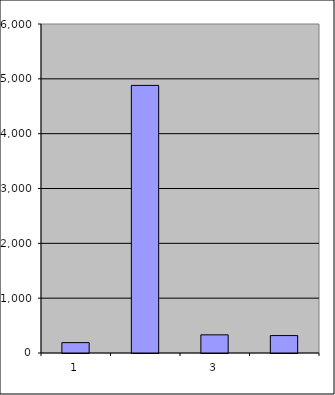
| Category | Series 0 |
|---|---|
| 0 | 189 |
| 1 | 4879.913 |
| 2 | 331.229 |
| 3 | 317.578 |